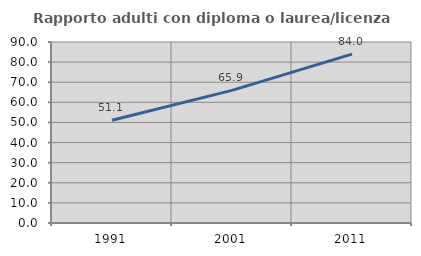
| Category | Rapporto adulti con diploma o laurea/licenza media  |
|---|---|
| 1991.0 | 51.115 |
| 2001.0 | 65.935 |
| 2011.0 | 83.969 |